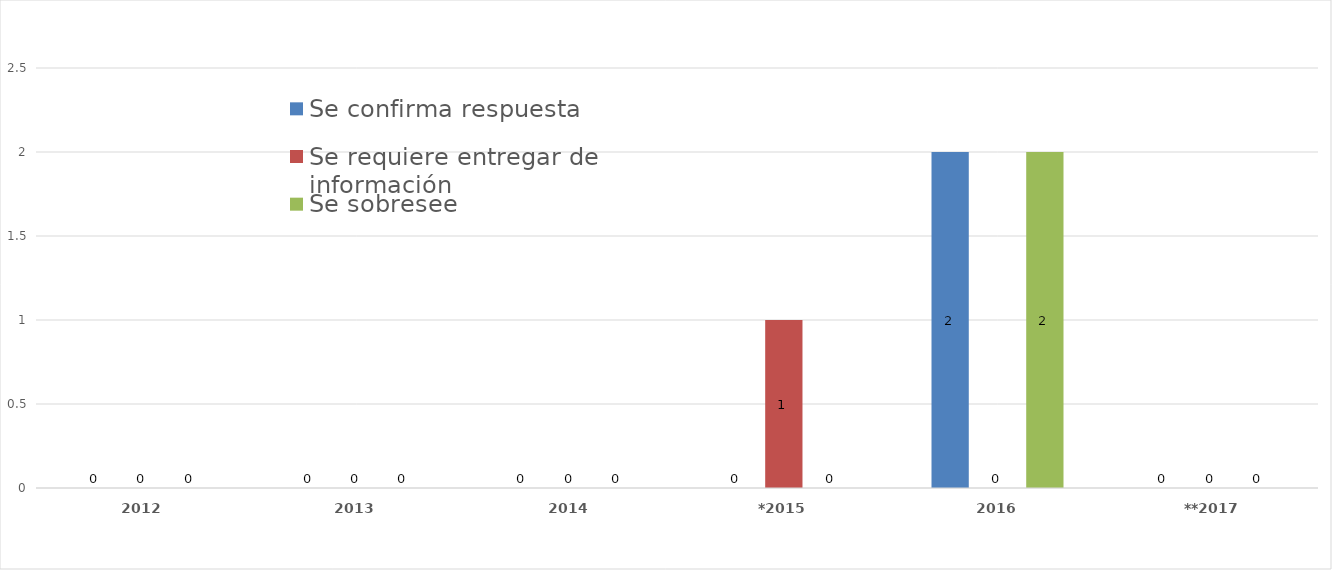
| Category | Se confirma respuesta | Se requiere entregar de información  | Se sobresee  |
|---|---|---|---|
| 2012 | 0 | 0 | 0 |
| 2013 | 0 | 0 | 0 |
| 2014 | 0 | 0 | 0 |
| *2015 | 0 | 1 | 0 |
| 2016 | 2 | 0 | 2 |
| **2017 | 0 | 0 | 0 |